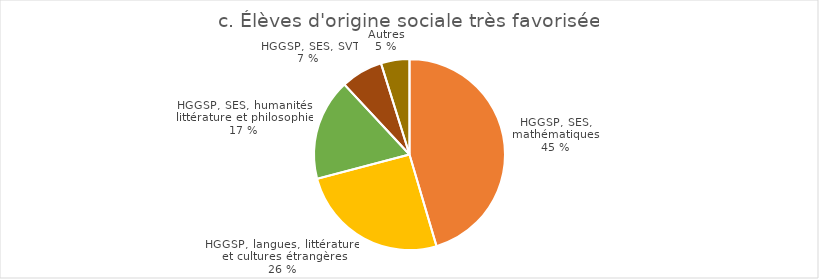
| Category | Élèves d'origine sociale très favorisée |
|---|---|
| HGGSP, SES, mathématiques | 8884 |
| HGGSP, SES, LLCER | 4978 |
| HGGSP, SES, humanités, littérature et philosophie | 3358 |
| HGGSP, SES, SVT | 1389 |
| Autres | 943 |